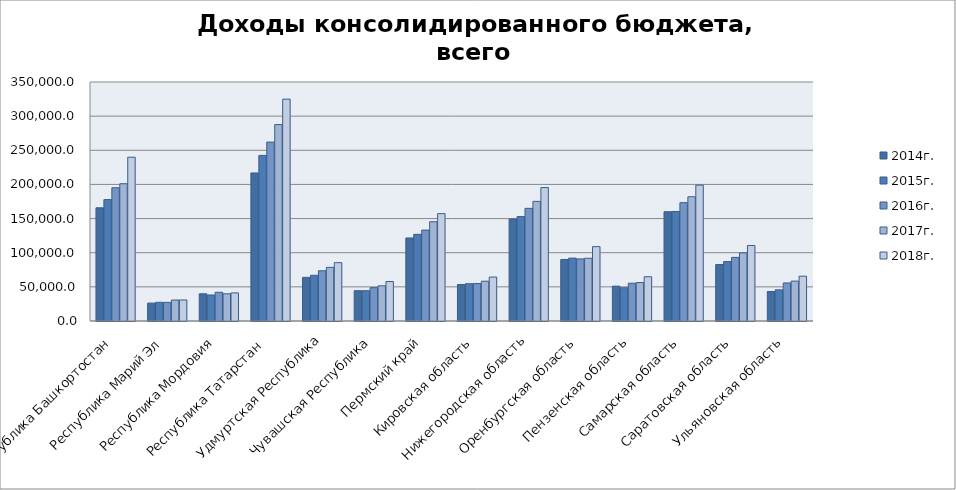
| Category | 2013г. | 2014г. | 2015г. | 2016г. | 2017г. | 2018г. |
|---|---|---|---|---|---|---|
| Республика Башкортостан |  | 165755.975 | 177799.731 | 195173.998 | 201001.232 | 239885.648 |
| Республика Марий Эл |  | 26196.802 | 27378.664 | 27269 | 30692.772 | 30821.582 |
| Республика Мордовия |  | 39876.319 | 38063.979 | 42063 | 39853.418 | 41149.412 |
| Республика Татарстан  |  | 216813.64 | 242485.595 | 261982.204 | 287664.017 | 324919.328 |
| Удмуртская Республика |  | 63927.494 | 66931.789 | 73564.348 | 78505.848 | 85440.62 |
| Чувашская Республика |  | 44382.275 | 44363.726 | 48793.885 | 51497.202 | 57790.513 |
| Пермский край |  | 121602.225 | 126934.175 | 133107.431 | 145352.92 | 157250.75 |
| Кировская область |  | 53375.291 | 54608.948 | 54841.679 | 58268.922 | 64349.12 |
| Нижегородская область |  | 149325.321 | 152928.485 | 164959.853 | 175161.393 | 195412.892 |
| Оренбургская область |  | 90088.784 | 92140.994 | 90903.019 | 91871.303 | 108900.738 |
| Пензенская область |  | 51047.262 | 48652.915 | 55321.165 | 56326.201 | 64808.761 |
| Самарская область |  | 160080.011 | 160370.168 | 173301.818 | 181960.149 | 198965.461 |
| Саратовская область |  | 82709.632 | 86999.324 | 93142.717 | 99722.286 | 110567.076 |
| Ульяновская область |  | 43186.141 | 45641.188 | 55717.059 | 58438.819 | 65613.193 |